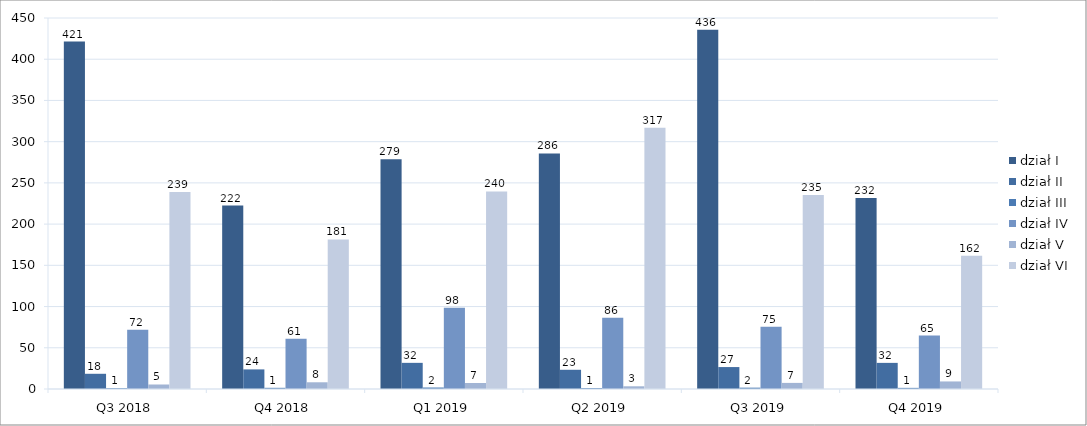
| Category | dział I | dział II | dział III | dział IV | dział V | dział VI |
|---|---|---|---|---|---|---|
| Q3 2018 | 421411 | 18448 | 1017 | 71846 | 5463 | 238969 |
| Q4 2018 | 222467 | 23765 | 1433 | 60969 | 8151 | 181378 |
| Q1 2019 | 278637 | 31717 | 1807 | 98480 | 7256 | 239593 |
| Q2 2019 | 285798 | 23309 | 1152 | 86464 | 3284 | 316861 |
| Q3 2019 | 435688 | 26613 | 1625 | 75360 | 7394 | 235280 |
| Q4 2019 | 231733 | 31686 | 1369 | 64758 | 9157 | 161592 |